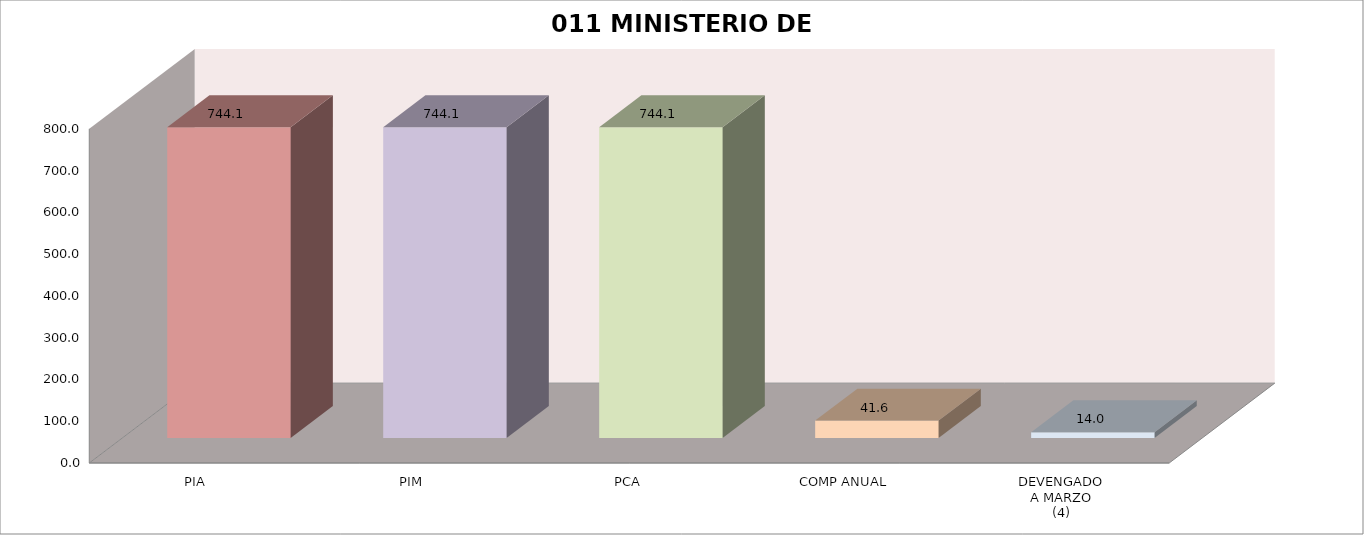
| Category | 011 MINISTERIO DE SALUD |
|---|---|
| PIA | 744.088 |
| PIM | 744.088 |
| PCA | 744.088 |
| COMP ANUAL | 41.595 |
| DEVENGADO
A MARZO
(4) | 13.972 |